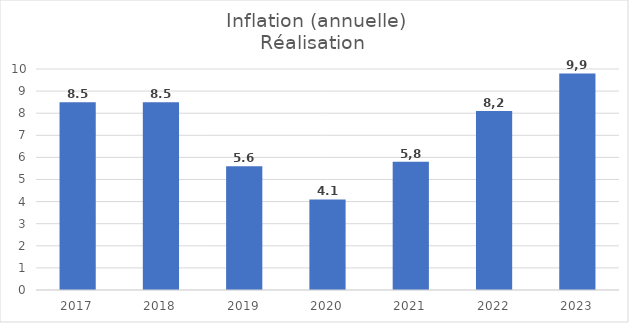
| Category | Inflation |
|---|---|
| 2017.0 | 8.5 |
| 2018.0 | 8.5 |
| 2019.0 | 5.6 |
| 2020.0 | 4.1 |
| 2021.0 | 5.8 |
| 2022.0 | 8.1 |
| 2023.0 | 9.8 |